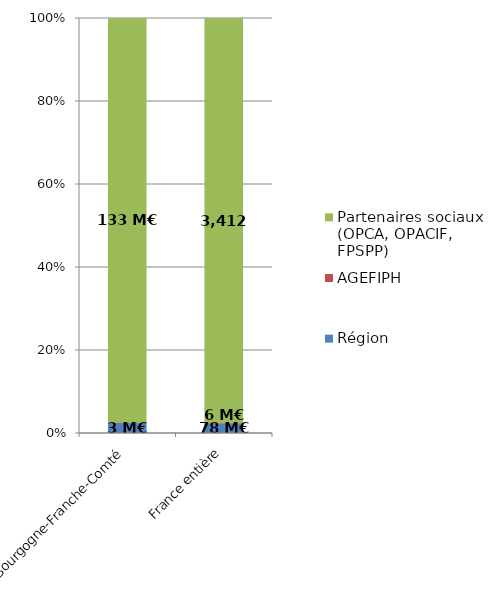
| Category | Région | AGEFIPH | Partenaires sociaux (OPCA, OPACIF, FPSPP) |
|---|---|---|---|
| Bourgogne-Franche-Comté | 3.369 | 0.135 | 132.901 |
| France entière | 77.612 | 6.161 | 3411.683 |